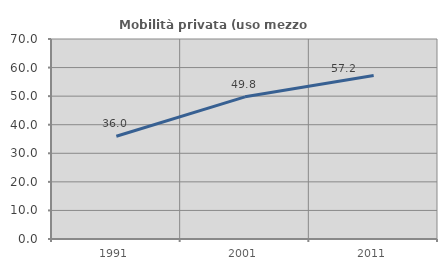
| Category | Mobilità privata (uso mezzo privato) |
|---|---|
| 1991.0 | 35.952 |
| 2001.0 | 49.767 |
| 2011.0 | 57.25 |